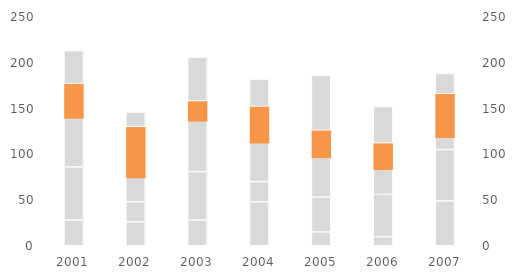
| Category | Prod A | Prod B | Prod C | Prod D | Prod E |
|---|---|---|---|---|---|
| 2001.0 | 28 | 58 | 54 | 37 | 36 |
| 2002.0 | 26 | 22 | 27 | 55 | 16 |
| 2003.0 | 28 | 53 | 56 | 21 | 48 |
| 2004.0 | 48 | 22 | 43 | 39 | 30 |
| 2005.0 | 15 | 38 | 44 | 29 | 60 |
| 2006.0 | 10 | 46 | 28 | 28 | 40 |
| 2007.0 | 49 | 56 | 14 | 47 | 22 |